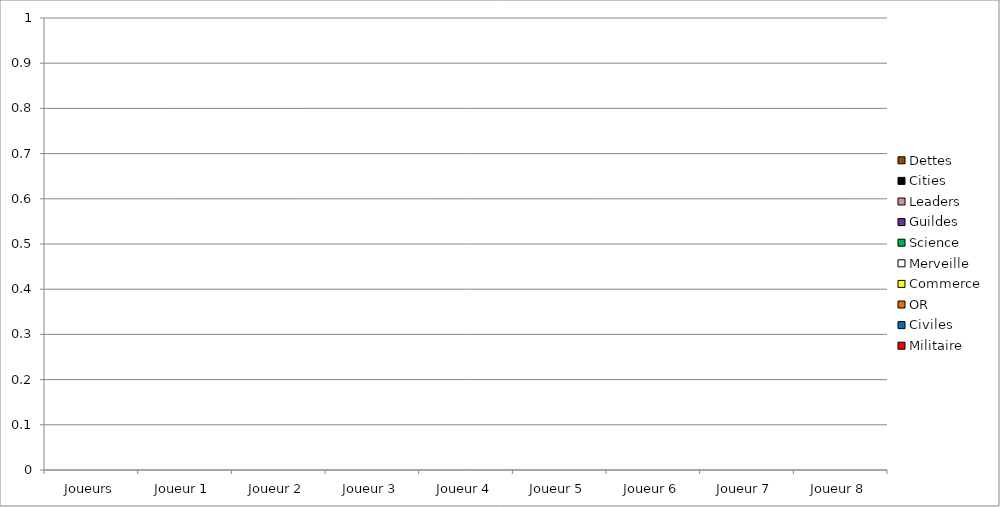
| Category | Militaire | Civiles | OR | Commerce | Merveille | Science | Guildes | Leaders | Cities | Dettes |
|---|---|---|---|---|---|---|---|---|---|---|
| Joueurs | 0 | 0 | 0 | 0 | 0 | 0 | 0 | 0 | 0 | 0 |
| Joueur 1 | 0 | 0 | 0 | 0 | 0 | 0 | 0 | 0 | 0 | 0 |
| Joueur 2 | 0 | 0 | 0 | 0 | 0 | 0 | 0 | 0 | 0 | 0 |
| Joueur 3 | 0 | 0 | 0 | 0 | 0 | 0 | 0 | 0 | 0 | 0 |
| Joueur 4 | 0 | 0 | 0 | 0 | 0 | 0 | 0 | 0 | 0 | 0 |
| Joueur 5 | 0 | 0 | 0 | 0 | 0 | 0 | 0 | 0 | 0 | 0 |
| Joueur 6 | 0 | 0 | 0 | 0 | 0 | 0 | 0 | 0 | 0 | 0 |
| Joueur 7 | 0 | 0 | 0 | 0 | 0 | 0 | 0 | 0 | 0 | 0 |
| Joueur 8 | 0 | 0 | 0 | 0 | 0 | 0 | 0 | 0 | 0 | 0 |